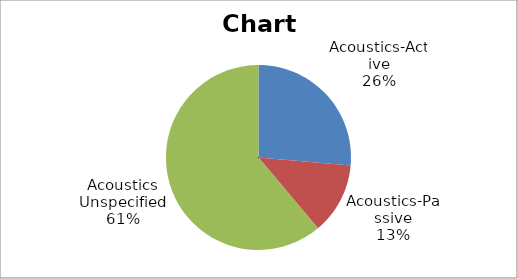
| Category | Series 0 |
|---|---|
| Acoustics-Active | 19 |
| Acoustics-Passive | 9 |
| Acoustics Unspecified | 44 |